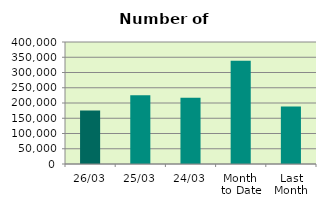
| Category | Series 0 |
|---|---|
| 26/03 | 175438 |
| 25/03 | 225214 |
| 24/03 | 216880 |
| Month 
to Date | 338258.105 |
| Last
Month | 188783.7 |